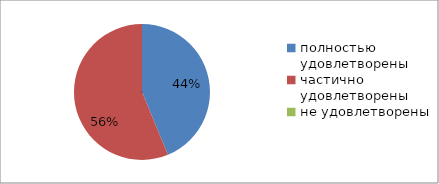
| Category | Series 0 |
|---|---|
| полностью удовлетворены | 43.8 |
| частично удовлетворены | 56.3 |
| не удовлетворены | 0 |